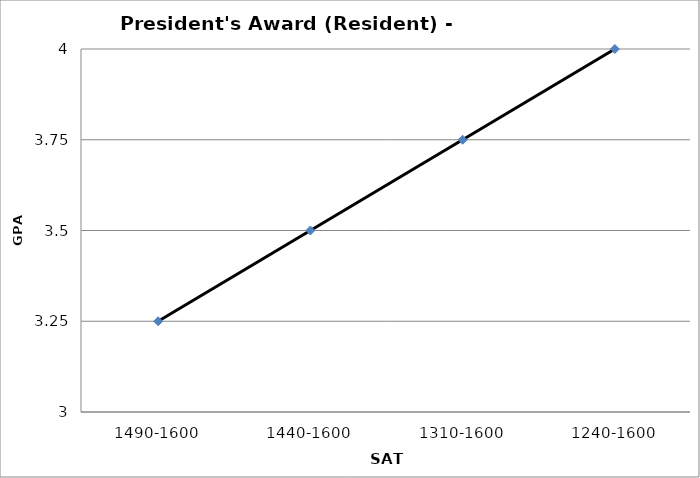
| Category | President's Award-$9000 |
|---|---|
| 1490-1600 | 3.25 |
| 1440-1600 | 3.5 |
| 1310-1600 | 3.75 |
| 1240-1600 | 4 |